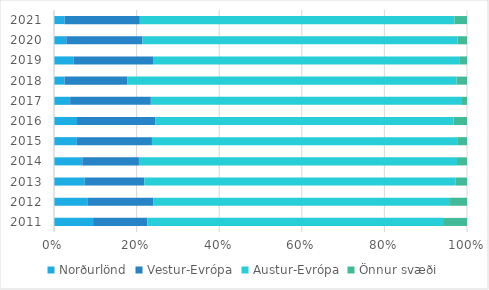
| Category | Norðurlönd | Vestur-Evrópa | Austur-Evrópa | Önnur svæði |
|---|---|---|---|---|
| 2011.0 | 0.095 | 0.132 | 0.716 | 0.058 |
| 2012.0 | 0.082 | 0.159 | 0.718 | 0.041 |
| 2013.0 | 0.074 | 0.144 | 0.753 | 0.028 |
| 2014.0 | 0.069 | 0.137 | 0.77 | 0.024 |
| 2015.0 | 0.055 | 0.182 | 0.739 | 0.024 |
| 2016.0 | 0.056 | 0.19 | 0.721 | 0.033 |
| 2017.0 | 0.039 | 0.195 | 0.751 | 0.014 |
| 2018.0 | 0.025 | 0.152 | 0.798 | 0.025 |
| 2019.0 | 0.048 | 0.192 | 0.741 | 0.019 |
| 2020.0 | 0.03 | 0.184 | 0.763 | 0.023 |
| 2021.0 | 0.025 | 0.18 | 0.752 | 0.03 |